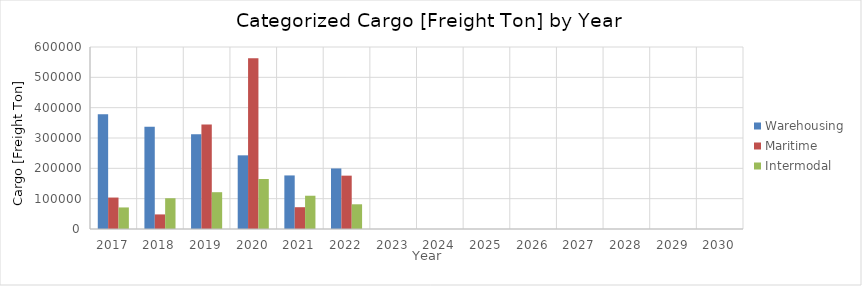
| Category | Warehousing | Maritime | Intermodal |
|---|---|---|---|
| 2017.0 | 378528 | 103672 | 71080 |
| 2018.0 | 337269 | 48076 | 101416 |
| 2019.0 | 312123 | 344295 | 121323 |
| 2020.0 | 242859 | 563028 | 164928 |
| 2021.0 | 176597 | 71854 | 109663 |
| 2022.0 | 199585 | 175870 | 81470 |
| 2023.0 | 0 | 0 | 0 |
| 2024.0 | 0 | 0 | 0 |
| 2025.0 | 0 | 0 | 0 |
| 2026.0 | 0 | 0 | 0 |
| 2027.0 | 0 | 0 | 0 |
| 2028.0 | 0 | 0 | 0 |
| 2029.0 | 0 | 0 | 0 |
| 2030.0 | 0 | 0 | 0 |